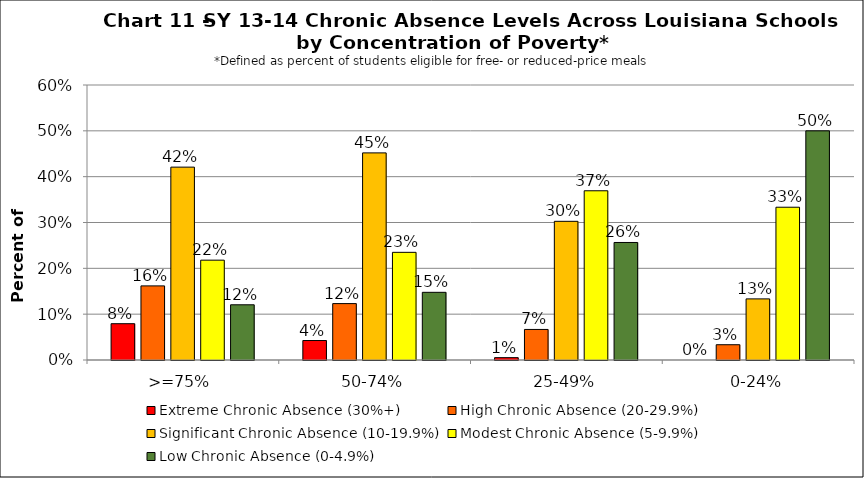
| Category | Extreme Chronic Absence (30%+) | High Chronic Absence (20-29.9%) | Significant Chronic Absence (10-19.9%) | Modest Chronic Absence (5-9.9%) | Low Chronic Absence (0-4.9%) |
|---|---|---|---|---|---|
| 0 | 0.079 | 0.162 | 0.421 | 0.218 | 0.12 |
| 1 | 0.043 | 0.123 | 0.452 | 0.235 | 0.148 |
| 2 | 0.005 | 0.067 | 0.303 | 0.369 | 0.256 |
| 3 | 0 | 0.033 | 0.133 | 0.333 | 0.5 |